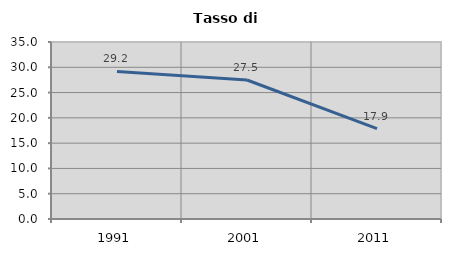
| Category | Tasso di disoccupazione   |
|---|---|
| 1991.0 | 29.183 |
| 2001.0 | 27.488 |
| 2011.0 | 17.857 |